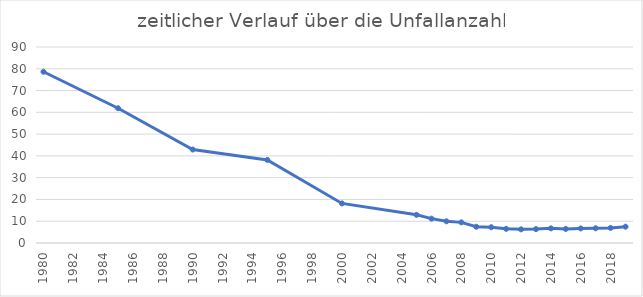
| Category | gesamt |
|---|---|
| 1980.0 | 78.63 |
| 1985.0 | 61.88 |
| 1990.0 | 42.92 |
| 1995.0 | 38.16 |
| 2000.0 | 18.17 |
| 2005.0 | 12.93 |
| 2006.0 | 11.18 |
| 2007.0 | 9.97 |
| 2008.0 | 9.47 |
| 2009.0 | 7.46 |
| 2010.0 | 7.25 |
| 2011.0 | 6.5 |
| 2012.0 | 6.27 |
| 2013.0 | 6.38 |
| 2014.0 | 6.72 |
| 2015.0 | 6.46 |
| 2016.0 | 6.68 |
| 2017.0 | 6.76 |
| 2018.0 | 6.92 |
| 2019.0 | 7.49 |